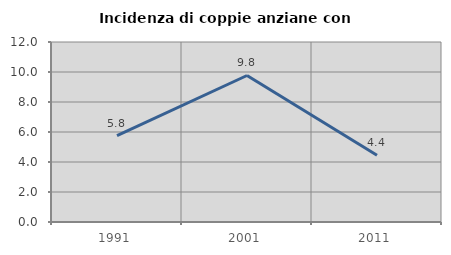
| Category | Incidenza di coppie anziane con figli |
|---|---|
| 1991.0 | 5.752 |
| 2001.0 | 9.767 |
| 2011.0 | 4.444 |